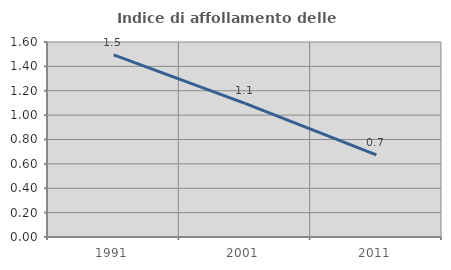
| Category | Indice di affollamento delle abitazioni  |
|---|---|
| 1991.0 | 1.495 |
| 2001.0 | 1.096 |
| 2011.0 | 0.674 |